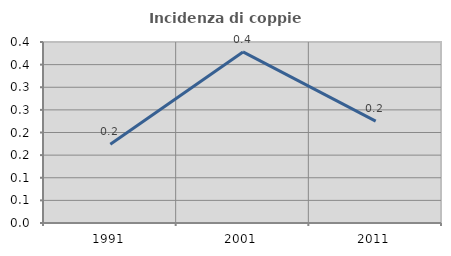
| Category | Incidenza di coppie miste |
|---|---|
| 1991.0 | 0.174 |
| 2001.0 | 0.378 |
| 2011.0 | 0.225 |